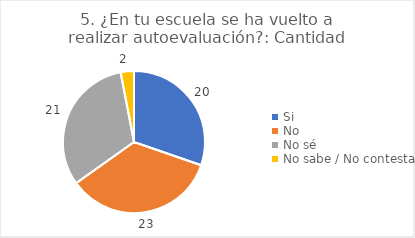
| Category | 5. ¿En tu escuela se ha vuelto a realizar autoevaluación?: |
|---|---|
| Si  | 0.303 |
| No  | 0.348 |
| No sé  | 0.318 |
| No sabe / No contesta | 0.03 |